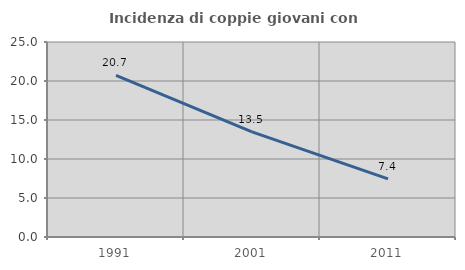
| Category | Incidenza di coppie giovani con figli |
|---|---|
| 1991.0 | 20.732 |
| 2001.0 | 13.485 |
| 2011.0 | 7.443 |